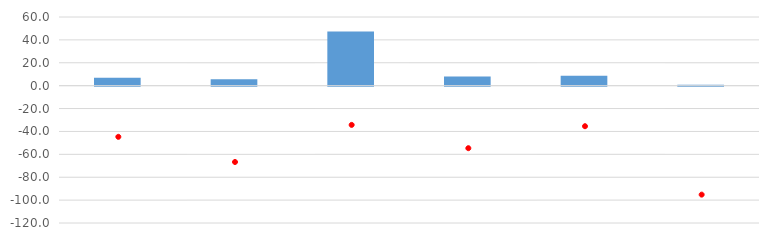
| Category | Quote % |
|---|---|
|  | 6.819 |
|  | 5.58 |
|  | 47.379 |
|  | 7.964 |
|  | 8.62 |
|  | 0.712 |